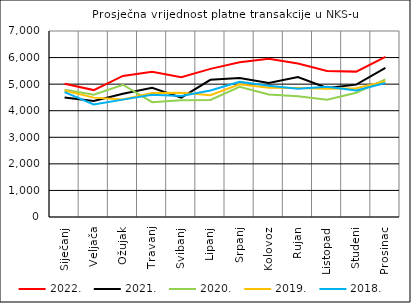
| Category | 2022. | 2021. | 2020. | 2019. | 2018. |
|---|---|---|---|---|---|
| Siječanj | 5017.964 | 4501.217 | 4785.453 | 4756.938 | 4699.327 |
| Veljača | 4776.729 | 4366.346 | 4600.667 | 4492.332 | 4233.973 |
| Ožujak | 5308.882 | 4637.126 | 4977.507 | 4420.241 | 4416.931 |
| Travanj | 5465.754 | 4862.032 | 4320.584 | 4662.373 | 4596.16 |
| Svibanj | 5261.395 | 4489.67 | 4391.599 | 4673.829 | 4554.417 |
| Lipanj | 5574.471 | 5164.117 | 4403.954 | 4580.613 | 4762.399 |
| Srpanj | 5821.923 | 5233.117 | 4900.246 | 4992.424 | 5089.862 |
| Kolovoz | 5956.123 | 5045.08 | 4610.588 | 4860.42 | 4939.616 |
| Rujan | 5773.669 | 5264.282 | 4547.865 | 4857.264 | 4826.8 |
| Listopad | 5495.534 | 4854.892 | 4410.988 | 4830.268 | 4898.03 |
| Studeni | 5471.22 | 4981.242 | 4675.64 | 4844.714 | 4760.926 |
| Prosinac | 6022.998 | 5610.271 | 5181.033 | 5104.254 | 5044.464 |